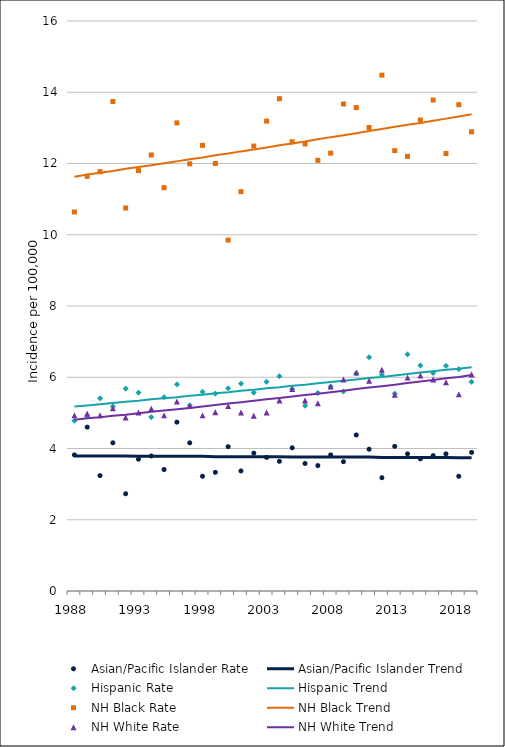
| Category | Asian/Pacific Islander Rate | Asian/Pacific Islander Trend | Hispanic Rate | Hispanic Trend | NH Black Rate | NH Black Trend | NH White Rate | NH White Trend |
|---|---|---|---|---|---|---|---|---|
| 1988.0 | 3.82 | 3.79 | 4.78 | 5.18 | 10.64 | 11.63 | 4.93 | 4.81 |
| 1989.0 | 4.6 | 3.79 | 4.91 | 5.21 | 11.64 | 11.69 | 4.98 | 4.85 |
| 1990.0 | 3.24 | 3.79 | 5.41 | 5.24 | 11.77 | 11.74 | 4.93 | 4.88 |
| 1991.0 | 4.16 | 3.79 | 5.18 | 5.28 | 13.74 | 11.79 | 5.13 | 4.92 |
| 1992.0 | 2.73 | 3.79 | 5.68 | 5.31 | 10.75 | 11.85 | 4.87 | 4.95 |
| 1993.0 | 3.7 | 3.78 | 5.57 | 5.34 | 11.8 | 11.9 | 5.01 | 4.99 |
| 1994.0 | 3.79 | 3.78 | 4.88 | 5.38 | 12.24 | 11.95 | 5.12 | 5.03 |
| 1995.0 | 3.41 | 3.78 | 5.44 | 5.41 | 11.32 | 12.01 | 4.93 | 5.07 |
| 1996.0 | 4.74 | 3.78 | 5.8 | 5.44 | 13.14 | 12.06 | 5.32 | 5.1 |
| 1997.0 | 4.16 | 3.78 | 5.21 | 5.48 | 11.99 | 12.12 | 5.2 | 5.14 |
| 1998.0 | 3.22 | 3.78 | 5.59 | 5.51 | 12.51 | 12.17 | 4.93 | 5.18 |
| 1999.0 | 3.33 | 3.77 | 5.54 | 5.55 | 12 | 12.23 | 5.02 | 5.22 |
| 2000.0 | 4.05 | 3.77 | 5.69 | 5.58 | 9.85 | 12.28 | 5.19 | 5.26 |
| 2001.0 | 3.37 | 3.77 | 5.82 | 5.62 | 11.21 | 12.34 | 5.01 | 5.3 |
| 2002.0 | 3.87 | 3.77 | 5.57 | 5.65 | 12.49 | 12.39 | 4.92 | 5.34 |
| 2003.0 | 3.75 | 3.77 | 5.87 | 5.69 | 13.19 | 12.45 | 5.01 | 5.38 |
| 2004.0 | 3.64 | 3.77 | 6.03 | 5.72 | 13.82 | 12.51 | 5.35 | 5.42 |
| 2005.0 | 4.02 | 3.76 | 5.67 | 5.76 | 12.61 | 12.56 | 5.67 | 5.46 |
| 2006.0 | 3.58 | 3.76 | 5.2 | 5.79 | 12.55 | 12.62 | 5.35 | 5.5 |
| 2007.0 | 3.52 | 3.76 | 5.56 | 5.83 | 12.09 | 12.68 | 5.27 | 5.54 |
| 2008.0 | 3.82 | 3.76 | 5.74 | 5.87 | 12.29 | 12.74 | 5.74 | 5.58 |
| 2009.0 | 3.63 | 3.76 | 5.6 | 5.9 | 13.67 | 12.79 | 5.94 | 5.62 |
| 2010.0 | 4.38 | 3.76 | 6.11 | 5.94 | 13.57 | 12.85 | 6.13 | 5.67 |
| 2011.0 | 3.98 | 3.76 | 6.56 | 5.98 | 13.01 | 12.91 | 5.9 | 5.71 |
| 2012.0 | 3.18 | 3.75 | 6.07 | 6.01 | 14.48 | 12.97 | 6.21 | 5.75 |
| 2013.0 | 4.06 | 3.75 | 5.54 | 6.05 | 12.36 | 13.03 | 5.51 | 5.79 |
| 2014.0 | 3.85 | 3.75 | 6.64 | 6.09 | 12.2 | 13.09 | 5.99 | 5.84 |
| 2015.0 | 3.71 | 3.75 | 6.33 | 6.13 | 13.22 | 13.14 | 6.05 | 5.88 |
| 2016.0 | 3.8 | 3.75 | 6.12 | 6.17 | 13.78 | 13.2 | 5.94 | 5.92 |
| 2017.0 | 3.85 | 3.75 | 6.32 | 6.21 | 12.28 | 13.26 | 5.86 | 5.97 |
| 2018.0 | 3.22 | 3.74 | 6.23 | 6.24 | 13.65 | 13.32 | 5.52 | 6.01 |
| 2019.0 | 3.89 | 3.74 | 5.87 | 6.28 | 12.89 | 13.38 | 6.08 | 6.06 |